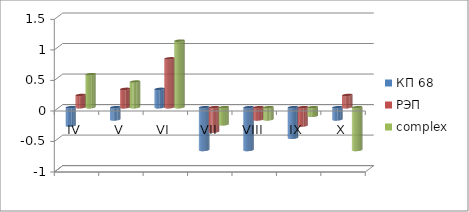
| Category | КП 68 | РЭП  | complex |
|---|---|---|---|
| IV | -0.3 | 0.2 | 0.54 |
| V | -0.2 | 0.3 | 0.42 |
| VI | 0.3 | 0.8 | 1.09 |
| VII | -0.7 | -0.4 | -0.28 |
| VIII | -0.7 | -0.2 | -0.2 |
| IX | -0.5 | -0.3 | -0.14 |
| X | -0.2 | 0.2 | -0.7 |